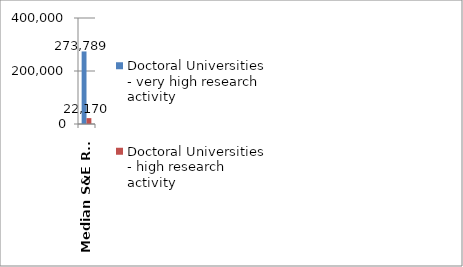
| Category | Doctoral Universities - very high research activity | Doctoral Universities - high research activity |
|---|---|---|
| Median S&E R&D Expenditures (1000s) | 273789 | 22170 |